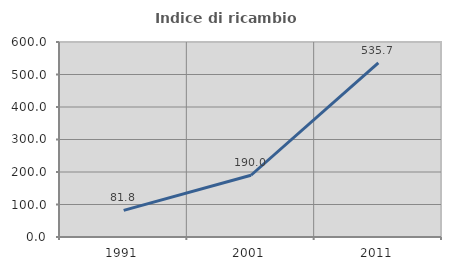
| Category | Indice di ricambio occupazionale  |
|---|---|
| 1991.0 | 81.818 |
| 2001.0 | 190 |
| 2011.0 | 535.714 |